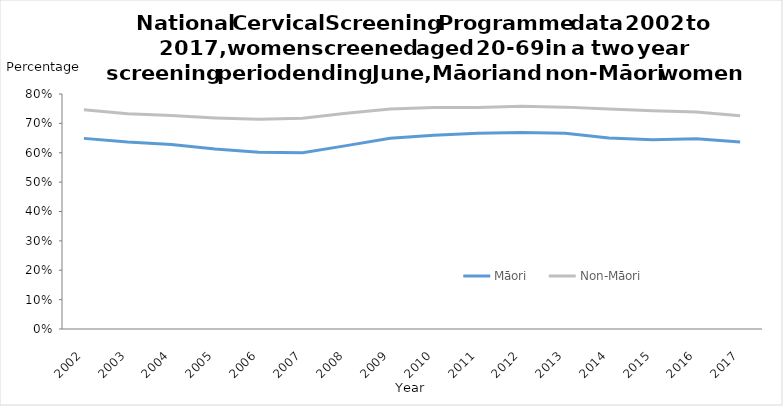
| Category | Māori | Non-Māori |
|---|---|---|
| 2002.0 | 0.649 | 0.746 |
| 2003.0 | 0.637 | 0.732 |
| 2004.0 | 0.628 | 0.727 |
| 2005.0 | 0.613 | 0.719 |
| 2006.0 | 0.602 | 0.714 |
| 2007.0 | 0.6 | 0.718 |
| 2008.0 | 0.624 | 0.735 |
| 2009.0 | 0.649 | 0.749 |
| 2010.0 | 0.66 | 0.754 |
| 2011.0 | 0.666 | 0.754 |
| 2012.0 | 0.669 | 0.758 |
| 2013.0 | 0.666 | 0.755 |
| 2014.0 | 0.65 | 0.749 |
| 2015.0 | 0.645 | 0.743 |
| 2016.0 | 0.647 | 0.739 |
| 2017.0 | 0.636 | 0.726 |